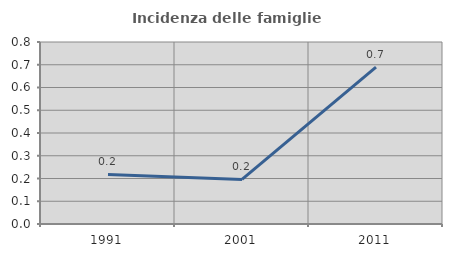
| Category | Incidenza delle famiglie numerose |
|---|---|
| 1991.0 | 0.218 |
| 2001.0 | 0.196 |
| 2011.0 | 0.69 |